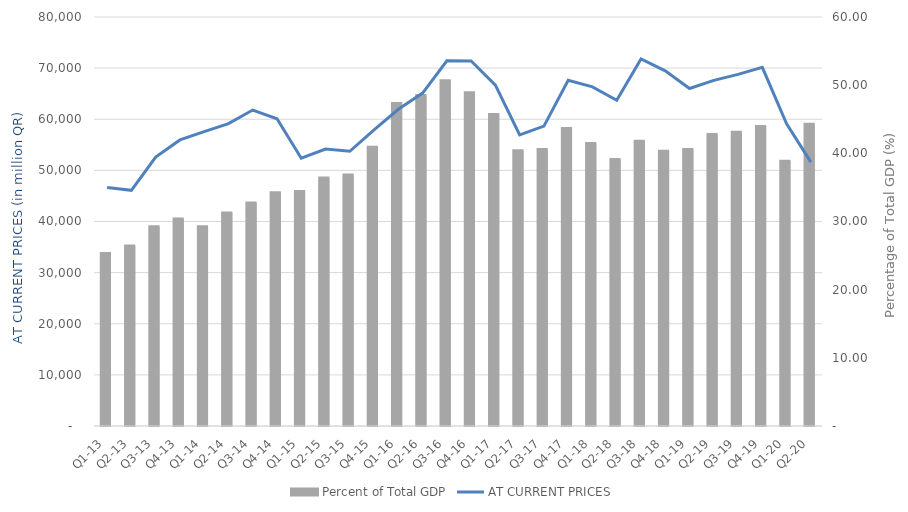
| Category | Percent of Total GDP |
|---|---|
| Q1-13 | 25.296 |
| Q2-13 | 26.401 |
| Q3-13 | 29.221 |
| Q4-13 | 30.351 |
| Q1-14 | 29.242 |
| Q2-14 | 31.241 |
| Q3-14 | 32.732 |
| Q4-14 | 34.227 |
| Q1-15 | 34.394 |
| Q2-15 | 36.394 |
| Q3-15 | 36.815 |
| Q4-15 | 40.908 |
| Q1-16 | 47.326 |
| Q2-16 | 48.48 |
| Q3-16 | 50.643 |
| Q4-16 | 48.896 |
| Q1-17 | 45.679 |
| Q2-17 | 40.382 |
| Q3-17 | 40.566 |
| Q4-17 | 43.659 |
| Q1-18 | 41.425 |
| Q2-18 | 39.101 |
| Q3-18 | 41.77 |
| Q4-18 | 40.312 |
| Q1-19 | 40.568 |
| Q2-19 | 42.75 |
| Q3-19 | 43.11 |
| Q4-19 | 43.933 |
| Q1-20 | 38.842 |
| Q2-20 | 44.266 |